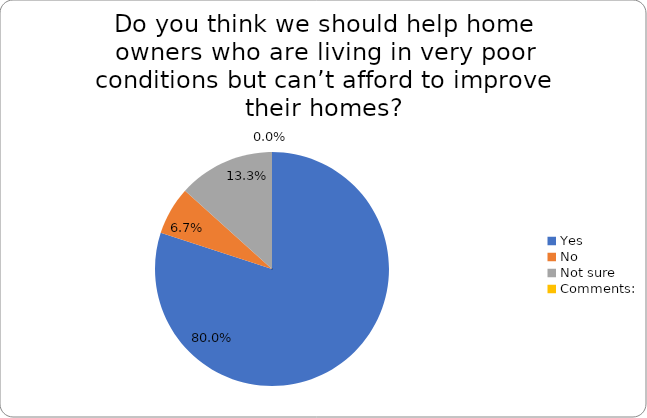
| Category | Series 0 |
|---|---|
| Yes | 0.8 |
| No | 0.067 |
| Not sure | 0.133 |
| Comments: | 0 |